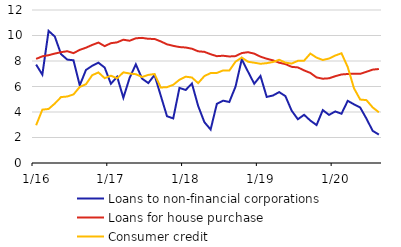
| Category | Loans to non-financial corporations | Loans for house purchase | Consumer credit |
|---|---|---|---|
|  1/16 | 7.719 | 8.163 | 2.96 |
| 2 | 6.928 | 8.368 | 4.184 |
| 3 | 10.362 | 8.454 | 4.237 |
| 4 | 9.918 | 8.583 | 4.663 |
| 5 | 8.537 | 8.692 | 5.171 |
| 6 | 8.109 | 8.768 | 5.214 |
| 7 | 8.057 | 8.617 | 5.377 |
| 8 | 6.09 | 8.871 | 5.965 |
| 9 | 7.299 | 9.044 | 6.179 |
| 10 | 7.625 | 9.26 | 6.887 |
| 11 | 7.866 | 9.446 | 7.103 |
| 12 | 7.485 | 9.166 | 6.655 |
|  1/17 | 6.213 | 9.397 | 6.847 |
| 2 | 6.765 | 9.463 | 6.648 |
| 3 | 5.115 | 9.671 | 7.111 |
| 4 | 6.673 | 9.588 | 7.018 |
| 5 | 7.74 | 9.782 | 6.965 |
| 6 | 6.618 | 9.815 | 6.745 |
| 7 | 6.269 | 9.74 | 6.909 |
| 8 | 6.902 | 9.729 | 6.978 |
| 9 | 5.281 | 9.537 | 5.921 |
| 10 | 3.669 | 9.308 | 5.949 |
| 11 | 3.496 | 9.188 | 6.133 |
| 12 | 5.891 | 9.094 | 6.528 |
|  1/18 | 5.728 | 9.059 | 6.772 |
| 2 | 6.234 | 8.964 | 6.704 |
| 3 | 4.475 | 8.76 | 6.263 |
| 4 | 3.204 | 8.718 | 6.82 |
| 5 | 2.625 | 8.532 | 7.051 |
| 6 | 4.638 | 8.379 | 7.065 |
| 7 | 4.89 | 8.413 | 7.26 |
| 8 | 4.785 | 8.355 | 7.247 |
| 9 | 5.993 | 8.384 | 7.95 |
| 10 | 8.137 | 8.622 | 8.271 |
| 11 | 7.165 | 8.691 | 7.942 |
| 12 | 6.217 | 8.578 | 7.867 |
|  1/19 | 6.825 | 8.341 | 7.783 |
| 2 | 5.184 | 8.179 | 7.832 |
| 3 | 5.293 | 8.052 | 7.921 |
| 4 | 5.561 | 7.865 | 8.096 |
| 5 | 5.245 | 7.758 | 7.872 |
| 6 | 4.106 | 7.542 | 7.8 |
| 7 | 3.433 | 7.497 | 8.014 |
| 8 | 3.78 | 7.263 | 8.026 |
| 9 | 3.328 | 7.065 | 8.582 |
| 10 | 2.975 | 6.712 | 8.265 |
| 11 | 4.148 | 6.61 | 8.079 |
| 12 | 3.774 | 6.644 | 8.193 |
|  1/20 | 4.044 | 6.808 | 8.429 |
| 2 | 3.864 | 6.944 | 8.607 |
| 3 | 4.875 | 6.98 | 7.526 |
| 4 | 4.604 | 7.006 | 5.865 |
| 5 | 4.35 | 6.994 | 4.977 |
| 6 | 3.485 | 7.153 | 4.932 |
| 7 | 2.524 | 7.323 | 4.362 |
| 8 | 2.228 | 7.373 | 3.975 |